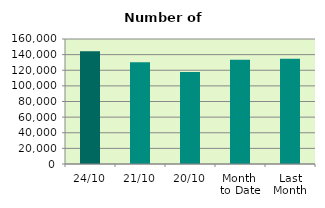
| Category | Series 0 |
|---|---|
| 24/10 | 144174 |
| 21/10 | 130286 |
| 20/10 | 117882 |
| Month 
to Date | 133388.625 |
| Last
Month | 134880 |